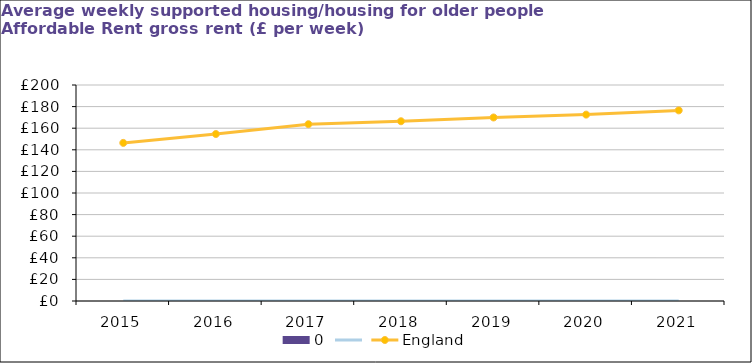
| Category | 0 |
|---|---|
| 2015.0 | 0 |
| 2016.0 | 0 |
| 2017.0 | 0 |
| 2018.0 | 0 |
| 2019.0 | 0 |
| 2020.0 | 0 |
| 2021.0 | 0 |